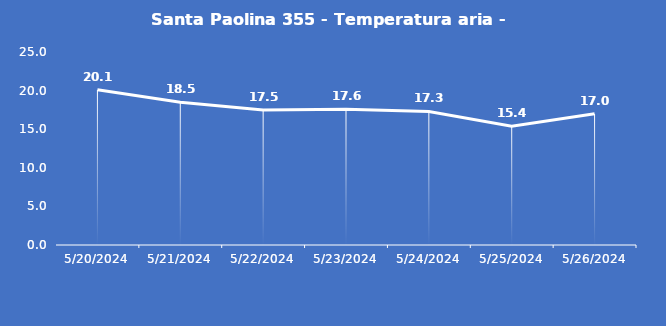
| Category | Santa Paolina 355 - Temperatura aria - Grezzo (°C) |
|---|---|
| 5/20/24 | 20.1 |
| 5/21/24 | 18.5 |
| 5/22/24 | 17.5 |
| 5/23/24 | 17.6 |
| 5/24/24 | 17.3 |
| 5/25/24 | 15.4 |
| 5/26/24 | 17 |